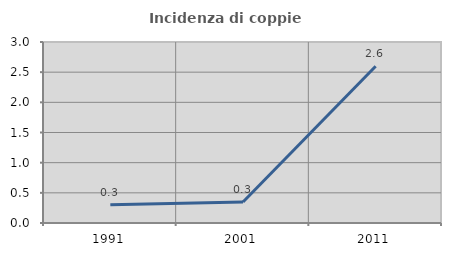
| Category | Incidenza di coppie miste |
|---|---|
| 1991.0 | 0.302 |
| 2001.0 | 0.347 |
| 2011.0 | 2.597 |